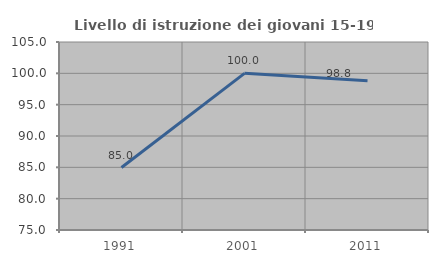
| Category | Livello di istruzione dei giovani 15-19 anni |
|---|---|
| 1991.0 | 84.967 |
| 2001.0 | 100 |
| 2011.0 | 98.824 |